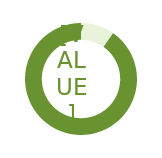
| Category | Series 0 |
|---|---|
| 0 | 0.097 |
| 1 | 0.903 |